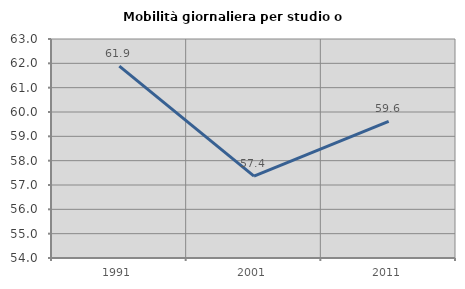
| Category | Mobilità giornaliera per studio o lavoro |
|---|---|
| 1991.0 | 61.884 |
| 2001.0 | 57.363 |
| 2011.0 | 59.611 |